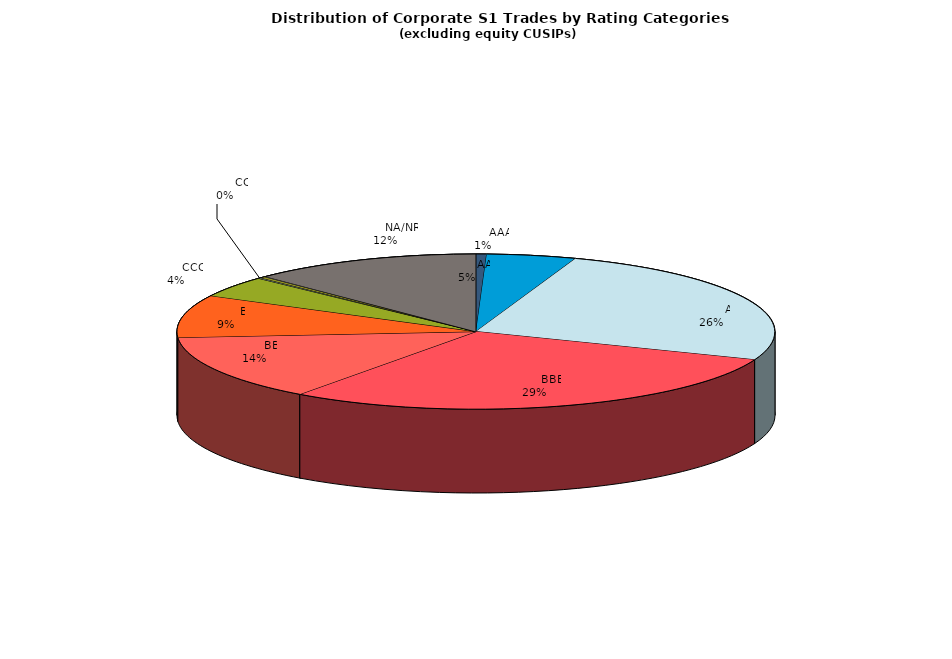
| Category | Series 0 |
|---|---|
|         AAA | 233.952 |
|         AA | 1981.563 |
|         A | 10467.726 |
|         BBB | 11941.016 |
|         BB | 5648.663 |
|         B | 3633.794 |
|         CCC | 1798.849 |
|         CC | 65.706 |
|         C | 123.532 |
|         D | 28.127 |
|         NA/NR | 5098.881 |